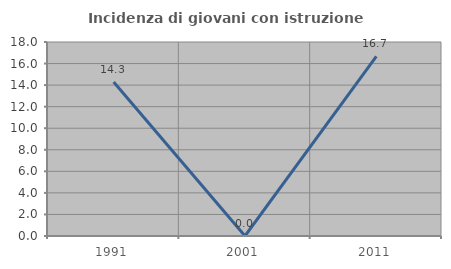
| Category | Incidenza di giovani con istruzione universitaria |
|---|---|
| 1991.0 | 14.286 |
| 2001.0 | 0 |
| 2011.0 | 16.667 |